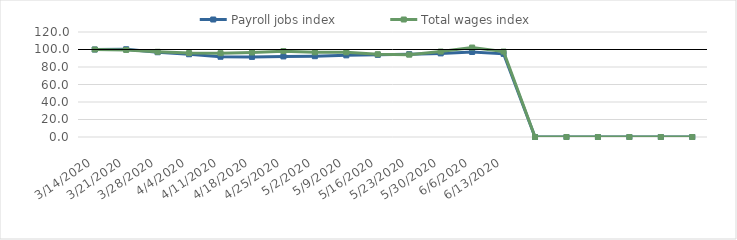
| Category | Payroll jobs index | Total wages index |
|---|---|---|
| 14/03/2020 | 100 | 100 |
| 21/03/2020 | 100.286 | 99.516 |
| 28/03/2020 | 96.865 | 97.36 |
| 04/04/2020 | 94.56 | 95.928 |
| 11/04/2020 | 91.711 | 95.768 |
| 18/04/2020 | 91.523 | 96.619 |
| 25/04/2020 | 92.076 | 98.129 |
| 02/05/2020 | 92.346 | 96.799 |
| 09/05/2020 | 93.314 | 96.831 |
| 16/05/2020 | 93.864 | 94.628 |
| 23/05/2020 | 94.662 | 94.124 |
| 30/05/2020 | 95.557 | 97.637 |
| 06/06/2020 | 97.152 | 102.23 |
| 13/06/2020 | 95.045 | 97.653 |